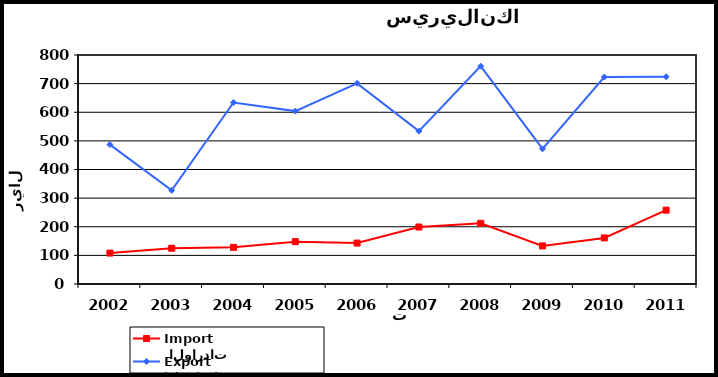
| Category |  الواردات           Import | الصادرات          Export |
|---|---|---|
| 2002.0 | 108 | 487 |
| 2003.0 | 125 | 327 |
| 2004.0 | 128 | 634 |
| 2005.0 | 148 | 604 |
| 2006.0 | 143 | 701 |
| 2007.0 | 199 | 534 |
| 2008.0 | 212 | 761 |
| 2009.0 | 133 | 472 |
| 2010.0 | 161 | 723 |
| 2011.0 | 258 | 724 |